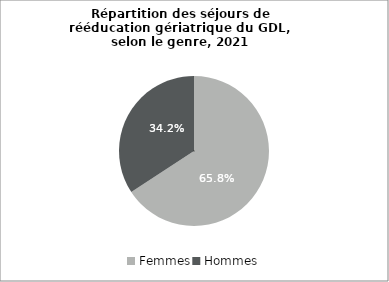
| Category | Series 0 |
|---|---|
| Femmes | 0.658 |
| Hommes | 0.342 |